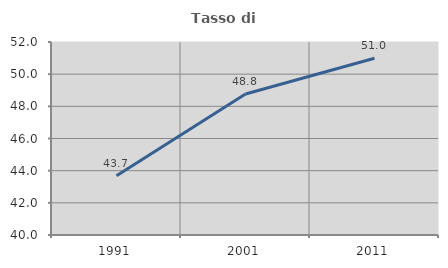
| Category | Tasso di occupazione   |
|---|---|
| 1991.0 | 43.678 |
| 2001.0 | 48.763 |
| 2011.0 | 50.987 |